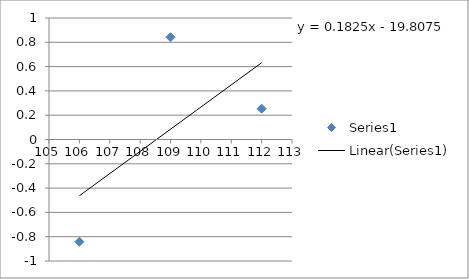
| Category | Series 0 |
|---|---|
| 106.0 | -0.842 |
| 109.0 | 0.842 |
| 112.0 | 0.253 |